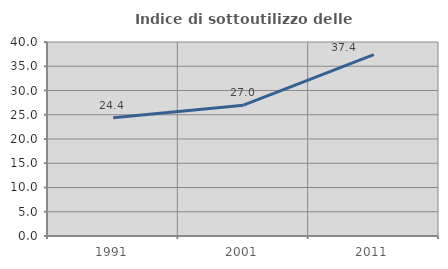
| Category | Indice di sottoutilizzo delle abitazioni  |
|---|---|
| 1991.0 | 24.397 |
| 2001.0 | 26.972 |
| 2011.0 | 37.396 |